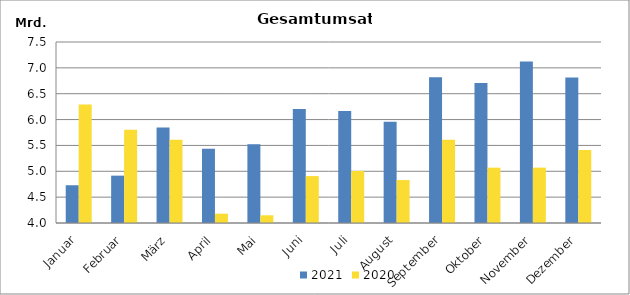
| Category | 2021 | 2020 |
|---|---|---|
| Januar | 4730116.201 | 6290450.745 |
| Februar | 4915400.323 | 5804665.347 |
| März | 5848978.824 | 5610770.431 |
| April | 5438005.23 | 4179957.874 |
| Mai | 5521617.468 | 4149026.854 |
| Juni | 6205316.767 | 4907347.798 |
| Juli | 6166274.133 | 5005392.032 |
| August | 5959798.513 | 4830246.397 |
| September | 6819159.884 | 5607535.652 |
| Oktober | 6709045.474 | 5069946.733 |
| November | 7122976.256 | 5070020.623 |
| Dezember | 6812289.938 | 5413584.041 |